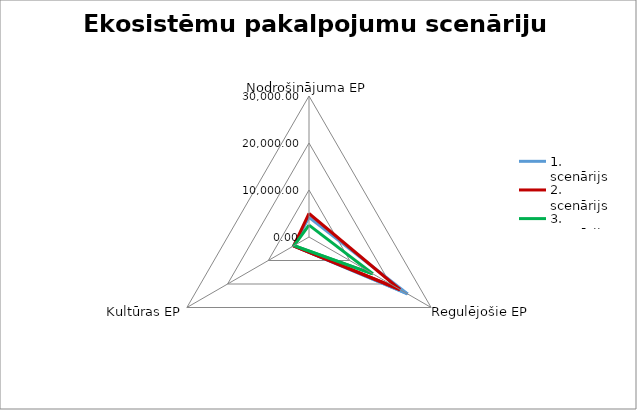
| Category | 1. scenārijs | 2. scenārijs | 3. scenārijs |
|---|---|---|---|
| Nodrošinājuma EP | 4194.927 | 5000.538 | 2525.591 |
| Regulējošie EP | 24231.553 | 22338.086 | 15661.38 |
| Kultūras EP | 3770.381 | 3770.381 | 3664.572 |